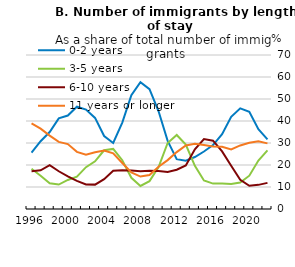
| Category | 0-2 years | 3-5 years | 6-10 years | 11 years or longer |
|---|---|---|---|---|
| 1996.0 | 25.574 | 18.275 | 17.192 | 38.958 |
| 1997.0 | 30.795 | 15.126 | 17.573 | 36.506 |
| 1998.0 | 34.971 | 11.713 | 19.957 | 33.359 |
| 1999.0 | 41.204 | 11.114 | 17.158 | 30.524 |
| 2000.0 | 42.493 | 13.211 | 14.801 | 29.496 |
| 2001.0 | 46.491 | 14.723 | 12.816 | 25.97 |
| 2002.0 | 45.203 | 19.011 | 11.159 | 24.626 |
| 2003.0 | 41.406 | 21.68 | 11.081 | 25.833 |
| 2004.0 | 33.165 | 26.681 | 13.573 | 26.582 |
| 2005.0 | 30.016 | 27.308 | 17.356 | 25.32 |
| 2006.0 | 39.293 | 22.181 | 17.639 | 20.887 |
| 2007.0 | 51.746 | 14.184 | 17.494 | 16.576 |
| 2008.0 | 57.632 | 10.48 | 17.143 | 14.746 |
| 2009.0 | 54.444 | 12.668 | 17.415 | 15.474 |
| 2010.0 | 44.422 | 19.08 | 17.303 | 19.195 |
| 2011.0 | 30.949 | 29.996 | 16.831 | 22.224 |
| 2012.0 | 22.646 | 33.654 | 17.847 | 25.853 |
| 2013.0 | 21.972 | 29.297 | 19.828 | 28.903 |
| 2014.0 | 23.614 | 19.61 | 27.177 | 29.599 |
| 2015.0 | 26.132 | 12.973 | 31.817 | 29.077 |
| 2016.0 | 29.036 | 11.547 | 31.038 | 28.379 |
| 2017.0 | 33.984 | 11.593 | 26.166 | 28.257 |
| 2018.0 | 41.886 | 11.375 | 19.682 | 27.057 |
| 2019.0 | 45.751 | 12.043 | 13.314 | 28.893 |
| 2020.0 | 44.201 | 15.147 | 10.545 | 30.107 |
| 2021.0 | 36.236 | 22.05 | 10.976 | 30.739 |
| 2022.0 | 31.63 | 26.68 | 11.87 | 29.821 |